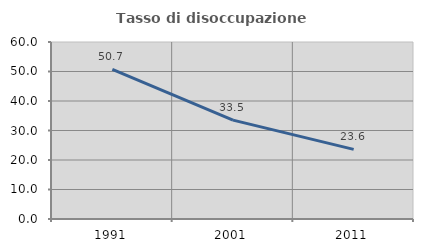
| Category | Tasso di disoccupazione giovanile  |
|---|---|
| 1991.0 | 50.725 |
| 2001.0 | 33.515 |
| 2011.0 | 23.588 |